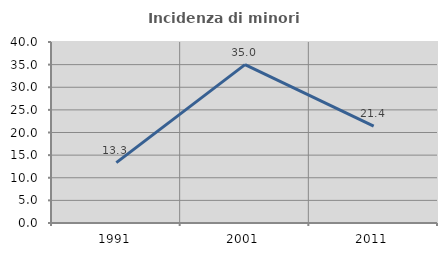
| Category | Incidenza di minori stranieri |
|---|---|
| 1991.0 | 13.333 |
| 2001.0 | 35 |
| 2011.0 | 21.429 |